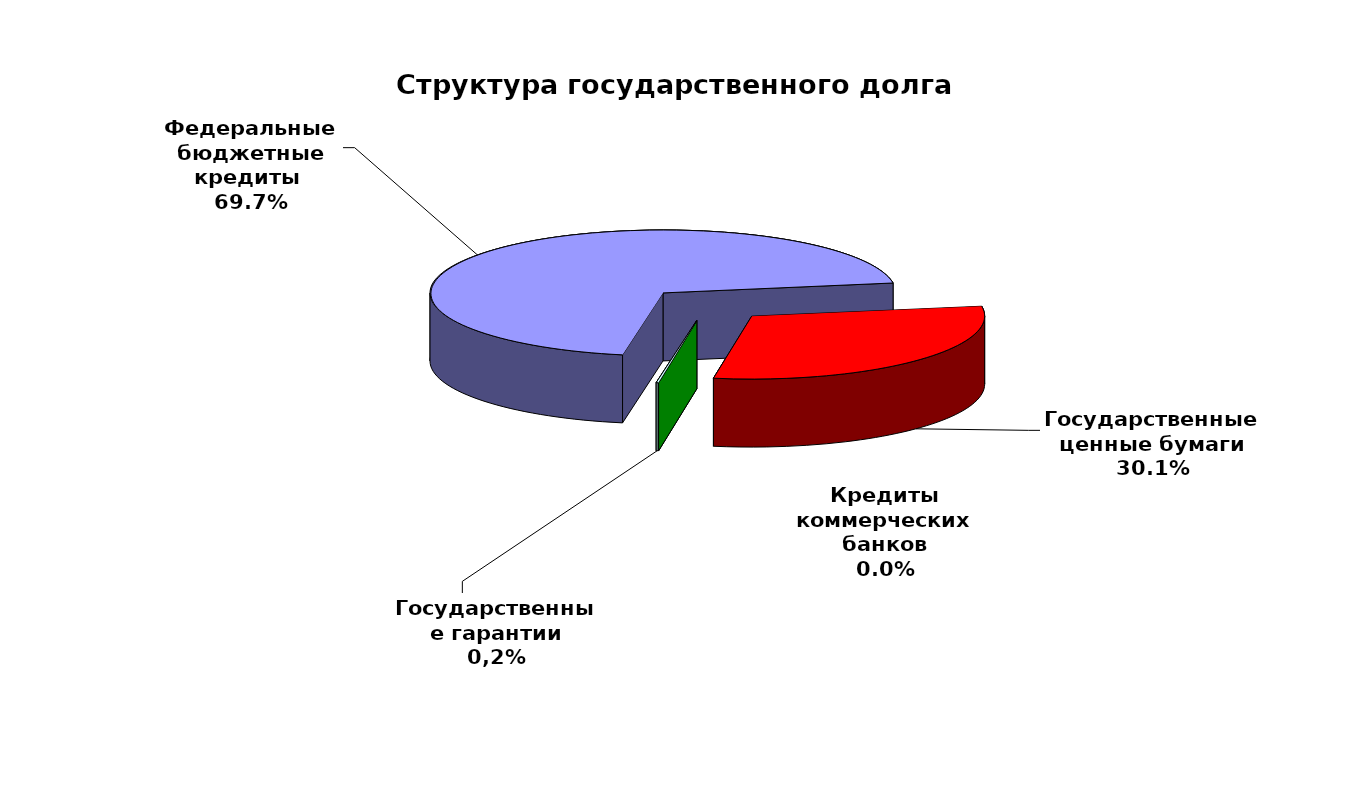
| Category | Series 0 |
|---|---|
| Федеральные бюджетные кредиты  | 91334953.061 |
| Государственные ценные бумаги | 39500000 |
| Кредиты коммерческих банков | 0 |
| Государственные гарантии | 201889.617 |